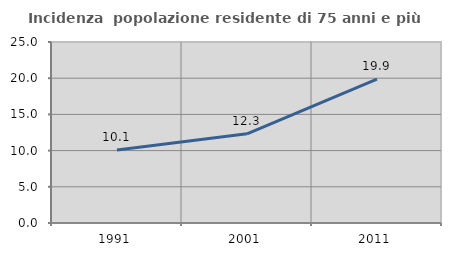
| Category | Incidenza  popolazione residente di 75 anni e più |
|---|---|
| 1991.0 | 10.08 |
| 2001.0 | 12.32 |
| 2011.0 | 19.866 |